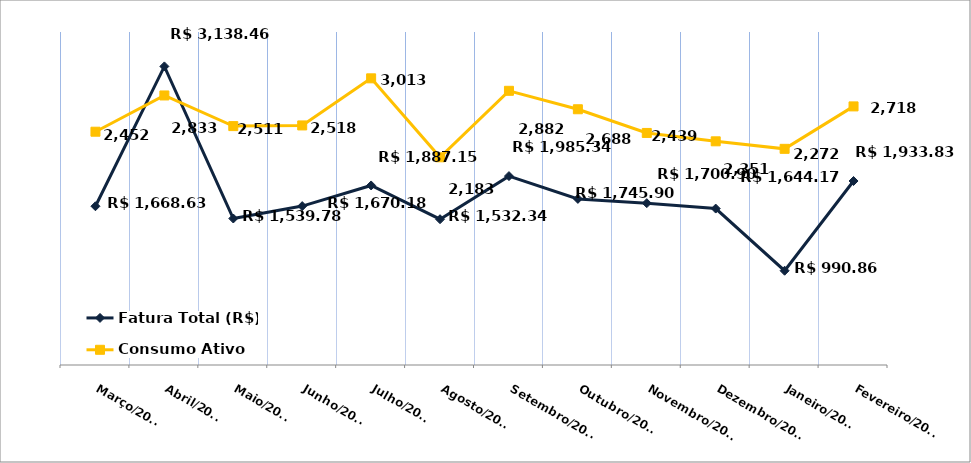
| Category | Fatura Total (R$) |
|---|---|
| Março/2023 | 1668.63 |
| Abril/2023 | 3138.46 |
| Maio/2023 | 1539.78 |
| Junho/2023 | 1670.18 |
| Julho/2023 | 1887.15 |
| Agosto/2023 | 1532.34 |
| Setembro/2023 | 1985.34 |
| Outubro/2023 | 1745.9 |
| Novembro/2023 | 1700.9 |
| Dezembro/2023 | 1644.17 |
| Janeiro/2024 | 990.86 |
| Fevereiro/2024 | 1933.83 |